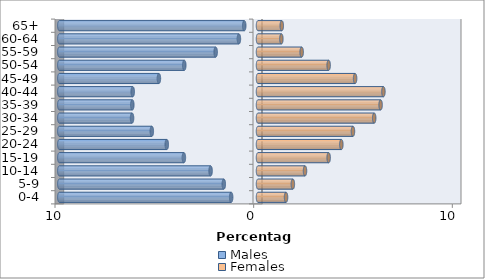
| Category | Males | Females |
|---|---|---|
| 0-4 | -1.351 | 1.412 |
| 5-9 | -1.721 | 1.755 |
| 10-14 | -2.387 | 2.367 |
| 15-19 | -3.731 | 3.557 |
| 20-24 | -4.592 | 4.195 |
| 25-29 | -5.345 | 4.78 |
| 30-34 | -6.34 | 5.849 |
| 35-39 | -6.326 | 6.172 |
| 40-44 | -6.306 | 6.313 |
| 45-49 | -4.989 | 4.888 |
| 50-54 | -3.711 | 3.557 |
| 55-59 | -2.131 | 2.198 |
| 60-64 | -0.961 | 1.177 |
| 65+ | -0.692 | 1.197 |